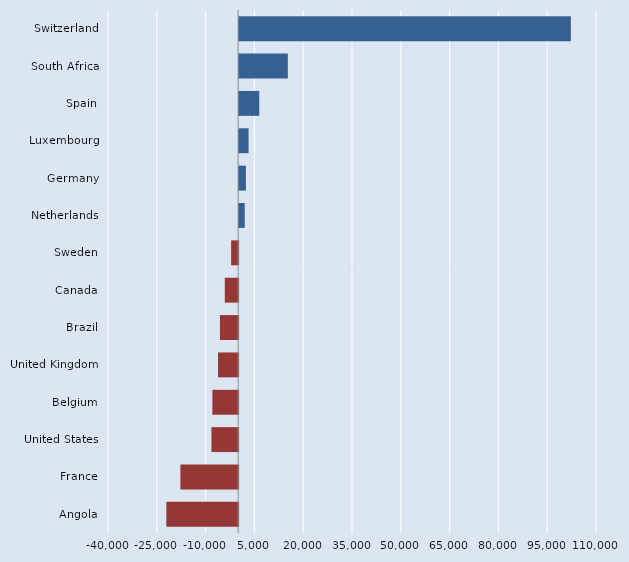
| Category | Series 0 |
|---|---|
| Switzerland | 101970 |
| South Africa | 14970 |
| Spain | 6190 |
| Luxembourg | 2900 |
| Germany | 2080 |
| Netherlands | 1720 |
| Sweden | -2160 |
| Canada | -4100 |
| Brazil | -5600 |
| United Kingdom | -6180 |
| Belgium | -7920 |
| United States | -8210 |
| France | -17750 |
| Angola | -22070 |